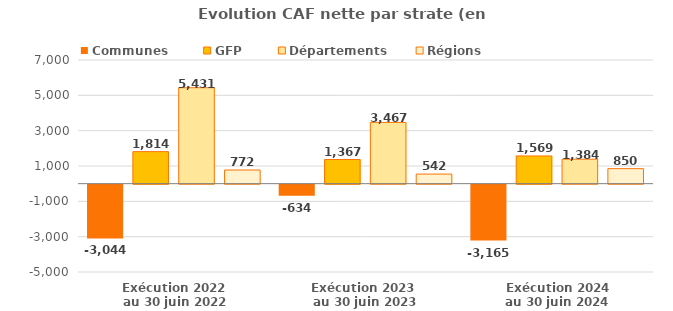
| Category | Communes  | GFP | Départements | Régions |
|---|---|---|---|---|
| Exécution 2022
 au 30 juin 2022 | -3043.6 | 1813.5 | 5431.3 | 771.9 |
| Exécution 2023 
au 30 juin 2023 | -633.7 | 1366.8 | 3466.5 | 542.4 |
| Exécution 2024
au 30 juin 2024 | -3164.8 | 1568.9 | 1384.1 | 849.5 |